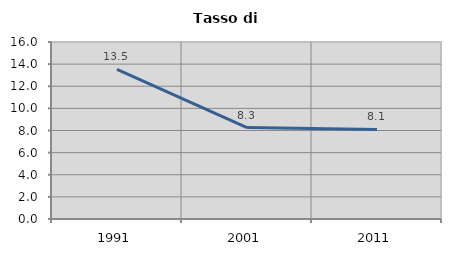
| Category | Tasso di disoccupazione   |
|---|---|
| 1991.0 | 13.52 |
| 2001.0 | 8.267 |
| 2011.0 | 8.096 |